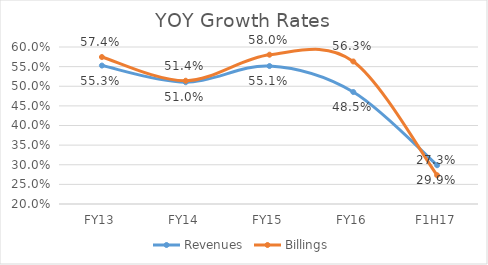
| Category | Revenues | Billings |
|---|---|---|
| FY13 | 0.553 | 0.574 |
| FY14 | 0.51 | 0.514 |
| FY15 | 0.551 | 0.58 |
| FY16 | 0.485 | 0.563 |
| F1H17 | 0.299 | 0.273 |